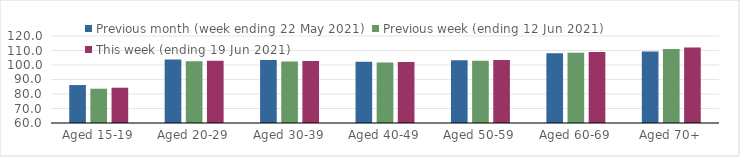
| Category | Previous month (week ending 22 May 2021) | Previous week (ending 12 Jun 2021) | This week (ending 19 Jun 2021) |
|---|---|---|---|
| Aged 15-19 | 86.17 | 83.63 | 84.33 |
| Aged 20-29 | 103.78 | 102.63 | 102.88 |
| Aged 30-39 | 103.42 | 102.43 | 102.74 |
| Aged 40-49 | 102.28 | 101.71 | 102.14 |
| Aged 50-59 | 103.2 | 102.97 | 103.5 |
| Aged 60-69 | 108.02 | 108.53 | 109.05 |
| Aged 70+ | 109.29 | 111.04 | 112.14 |